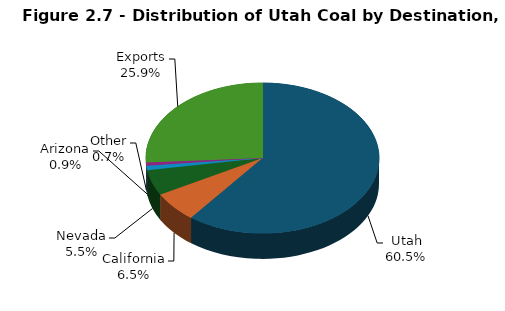
| Category | Series 0 |
|---|---|
| Utah | 9243.151 |
| California | 990.885 |
| Nevada | 834.972 |
| Arizona | 141.384 |
| Other | 109.77 |
| Exports | 3964.1 |